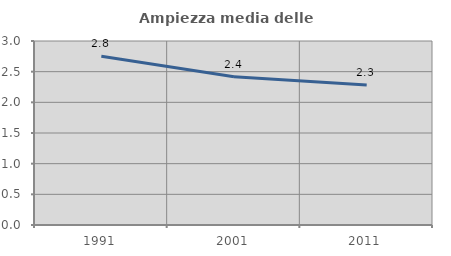
| Category | Ampiezza media delle famiglie |
|---|---|
| 1991.0 | 2.753 |
| 2001.0 | 2.417 |
| 2011.0 | 2.282 |